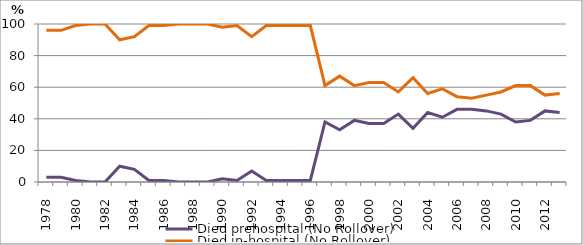
| Category | Died prehospital (No Rollover) | Died in-hospital (No Rollover) |
|---|---|---|
| 1978.0 | 3 | 96 |
| 1979.0 | 3 | 96 |
| 1980.0 | 1 | 99 |
| 1981.0 | 0 | 100 |
| 1982.0 | 0 | 100 |
| 1983.0 | 10 | 90 |
| 1984.0 | 8 | 92 |
| 1985.0 | 1 | 99 |
| 1986.0 | 1 | 99 |
| 1987.0 | 0 | 100 |
| 1988.0 | 0 | 100 |
| 1989.0 | 0 | 100 |
| 1990.0 | 2 | 98 |
| 1991.0 | 1 | 99 |
| 1992.0 | 7 | 92 |
| 1993.0 | 1 | 99 |
| 1994.0 | 1 | 99 |
| 1995.0 | 1 | 99 |
| 1996.0 | 1 | 99 |
| 1997.0 | 38 | 61 |
| 1998.0 | 33 | 67 |
| 1999.0 | 39 | 61 |
| 2000.0 | 37 | 63 |
| 2001.0 | 37 | 63 |
| 2002.0 | 43 | 57 |
| 2003.0 | 34 | 66 |
| 2004.0 | 44 | 56 |
| 2005.0 | 41 | 59 |
| 2006.0 | 46 | 54 |
| 2007.0 | 46 | 53 |
| 2008.0 | 45 | 55 |
| 2009.0 | 43 | 57 |
| 2010.0 | 38 | 61 |
| 2011.0 | 39 | 61 |
| 2012.0 | 45 | 55 |
| 2013.0 | 44 | 56 |